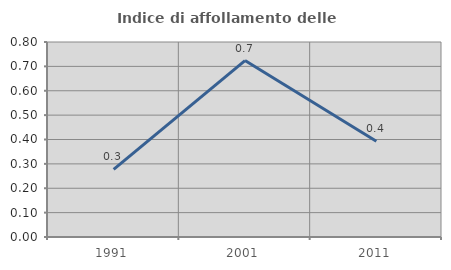
| Category | Indice di affollamento delle abitazioni  |
|---|---|
| 1991.0 | 0.277 |
| 2001.0 | 0.724 |
| 2011.0 | 0.393 |